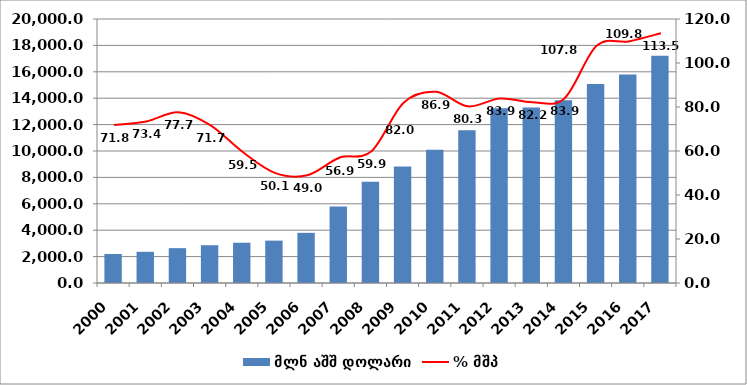
| Category | მლნ აშშ დოლარი |
|---|---|
| 2000.0 | 2195.069 |
| 2001.0 | 2364.019 |
| 2002.0 | 2638.739 |
| 2003.0 | 2861.027 |
| 2004.0 | 3050.926 |
| 2005.0 | 3210.442 |
| 2006.0 | 3800.544 |
| 2007.0 | 5790.241 |
| 2008.0 | 7667.716 |
| 2009.0 | 8826.472 |
| 2010.0 | 10102.737 |
| 2011.0 | 11578.652 |
| 2012.0 | 13242.811 |
| 2013.0 | 13295.547 |
| 2014.0 | 13851.617 |
| 2015.0 | 15083.141 |
| 2016.0 | 15788.793 |
| 2017.0 | 17216.885 |